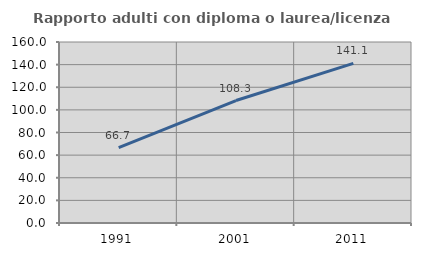
| Category | Rapporto adulti con diploma o laurea/licenza media  |
|---|---|
| 1991.0 | 66.708 |
| 2001.0 | 108.251 |
| 2011.0 | 141.101 |